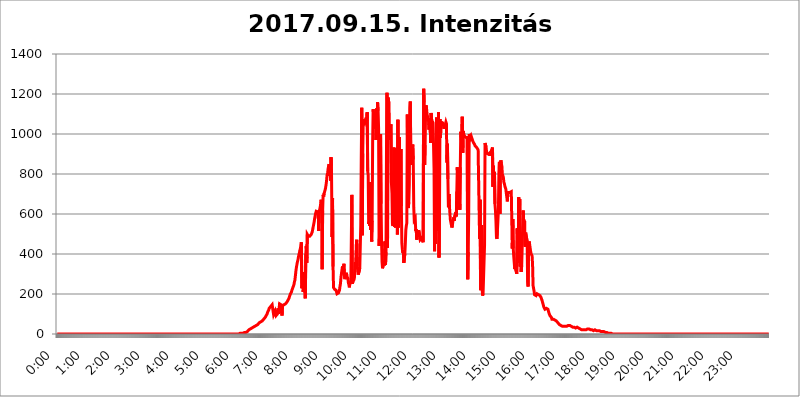
| Category | 2017.09.15. Intenzitás [W/m^2] |
|---|---|
| 0.0 | 0 |
| 0.0006944444444444445 | 0 |
| 0.001388888888888889 | 0 |
| 0.0020833333333333333 | 0 |
| 0.002777777777777778 | 0 |
| 0.003472222222222222 | 0 |
| 0.004166666666666667 | 0 |
| 0.004861111111111111 | 0 |
| 0.005555555555555556 | 0 |
| 0.0062499999999999995 | 0 |
| 0.006944444444444444 | 0 |
| 0.007638888888888889 | 0 |
| 0.008333333333333333 | 0 |
| 0.009027777777777779 | 0 |
| 0.009722222222222222 | 0 |
| 0.010416666666666666 | 0 |
| 0.011111111111111112 | 0 |
| 0.011805555555555555 | 0 |
| 0.012499999999999999 | 0 |
| 0.013194444444444444 | 0 |
| 0.013888888888888888 | 0 |
| 0.014583333333333332 | 0 |
| 0.015277777777777777 | 0 |
| 0.015972222222222224 | 0 |
| 0.016666666666666666 | 0 |
| 0.017361111111111112 | 0 |
| 0.018055555555555557 | 0 |
| 0.01875 | 0 |
| 0.019444444444444445 | 0 |
| 0.02013888888888889 | 0 |
| 0.020833333333333332 | 0 |
| 0.02152777777777778 | 0 |
| 0.022222222222222223 | 0 |
| 0.02291666666666667 | 0 |
| 0.02361111111111111 | 0 |
| 0.024305555555555556 | 0 |
| 0.024999999999999998 | 0 |
| 0.025694444444444447 | 0 |
| 0.02638888888888889 | 0 |
| 0.027083333333333334 | 0 |
| 0.027777777777777776 | 0 |
| 0.02847222222222222 | 0 |
| 0.029166666666666664 | 0 |
| 0.029861111111111113 | 0 |
| 0.030555555555555555 | 0 |
| 0.03125 | 0 |
| 0.03194444444444445 | 0 |
| 0.03263888888888889 | 0 |
| 0.03333333333333333 | 0 |
| 0.034027777777777775 | 0 |
| 0.034722222222222224 | 0 |
| 0.035416666666666666 | 0 |
| 0.036111111111111115 | 0 |
| 0.03680555555555556 | 0 |
| 0.0375 | 0 |
| 0.03819444444444444 | 0 |
| 0.03888888888888889 | 0 |
| 0.03958333333333333 | 0 |
| 0.04027777777777778 | 0 |
| 0.04097222222222222 | 0 |
| 0.041666666666666664 | 0 |
| 0.042361111111111106 | 0 |
| 0.04305555555555556 | 0 |
| 0.043750000000000004 | 0 |
| 0.044444444444444446 | 0 |
| 0.04513888888888889 | 0 |
| 0.04583333333333334 | 0 |
| 0.04652777777777778 | 0 |
| 0.04722222222222222 | 0 |
| 0.04791666666666666 | 0 |
| 0.04861111111111111 | 0 |
| 0.049305555555555554 | 0 |
| 0.049999999999999996 | 0 |
| 0.05069444444444445 | 0 |
| 0.051388888888888894 | 0 |
| 0.052083333333333336 | 0 |
| 0.05277777777777778 | 0 |
| 0.05347222222222222 | 0 |
| 0.05416666666666667 | 0 |
| 0.05486111111111111 | 0 |
| 0.05555555555555555 | 0 |
| 0.05625 | 0 |
| 0.05694444444444444 | 0 |
| 0.057638888888888885 | 0 |
| 0.05833333333333333 | 0 |
| 0.05902777777777778 | 0 |
| 0.059722222222222225 | 0 |
| 0.06041666666666667 | 0 |
| 0.061111111111111116 | 0 |
| 0.06180555555555556 | 0 |
| 0.0625 | 0 |
| 0.06319444444444444 | 0 |
| 0.06388888888888888 | 0 |
| 0.06458333333333334 | 0 |
| 0.06527777777777778 | 0 |
| 0.06597222222222222 | 0 |
| 0.06666666666666667 | 0 |
| 0.06736111111111111 | 0 |
| 0.06805555555555555 | 0 |
| 0.06874999999999999 | 0 |
| 0.06944444444444443 | 0 |
| 0.07013888888888889 | 0 |
| 0.07083333333333333 | 0 |
| 0.07152777777777779 | 0 |
| 0.07222222222222223 | 0 |
| 0.07291666666666667 | 0 |
| 0.07361111111111111 | 0 |
| 0.07430555555555556 | 0 |
| 0.075 | 0 |
| 0.07569444444444444 | 0 |
| 0.0763888888888889 | 0 |
| 0.07708333333333334 | 0 |
| 0.07777777777777778 | 0 |
| 0.07847222222222222 | 0 |
| 0.07916666666666666 | 0 |
| 0.0798611111111111 | 0 |
| 0.08055555555555556 | 0 |
| 0.08125 | 0 |
| 0.08194444444444444 | 0 |
| 0.08263888888888889 | 0 |
| 0.08333333333333333 | 0 |
| 0.08402777777777777 | 0 |
| 0.08472222222222221 | 0 |
| 0.08541666666666665 | 0 |
| 0.08611111111111112 | 0 |
| 0.08680555555555557 | 0 |
| 0.08750000000000001 | 0 |
| 0.08819444444444445 | 0 |
| 0.08888888888888889 | 0 |
| 0.08958333333333333 | 0 |
| 0.09027777777777778 | 0 |
| 0.09097222222222222 | 0 |
| 0.09166666666666667 | 0 |
| 0.09236111111111112 | 0 |
| 0.09305555555555556 | 0 |
| 0.09375 | 0 |
| 0.09444444444444444 | 0 |
| 0.09513888888888888 | 0 |
| 0.09583333333333333 | 0 |
| 0.09652777777777777 | 0 |
| 0.09722222222222222 | 0 |
| 0.09791666666666667 | 0 |
| 0.09861111111111111 | 0 |
| 0.09930555555555555 | 0 |
| 0.09999999999999999 | 0 |
| 0.10069444444444443 | 0 |
| 0.1013888888888889 | 0 |
| 0.10208333333333335 | 0 |
| 0.10277777777777779 | 0 |
| 0.10347222222222223 | 0 |
| 0.10416666666666667 | 0 |
| 0.10486111111111111 | 0 |
| 0.10555555555555556 | 0 |
| 0.10625 | 0 |
| 0.10694444444444444 | 0 |
| 0.1076388888888889 | 0 |
| 0.10833333333333334 | 0 |
| 0.10902777777777778 | 0 |
| 0.10972222222222222 | 0 |
| 0.1111111111111111 | 0 |
| 0.11180555555555556 | 0 |
| 0.11180555555555556 | 0 |
| 0.1125 | 0 |
| 0.11319444444444444 | 0 |
| 0.11388888888888889 | 0 |
| 0.11458333333333333 | 0 |
| 0.11527777777777777 | 0 |
| 0.11597222222222221 | 0 |
| 0.11666666666666665 | 0 |
| 0.1173611111111111 | 0 |
| 0.11805555555555557 | 0 |
| 0.11944444444444445 | 0 |
| 0.12013888888888889 | 0 |
| 0.12083333333333333 | 0 |
| 0.12152777777777778 | 0 |
| 0.12222222222222223 | 0 |
| 0.12291666666666667 | 0 |
| 0.12291666666666667 | 0 |
| 0.12361111111111112 | 0 |
| 0.12430555555555556 | 0 |
| 0.125 | 0 |
| 0.12569444444444444 | 0 |
| 0.12638888888888888 | 0 |
| 0.12708333333333333 | 0 |
| 0.16875 | 0 |
| 0.12847222222222224 | 0 |
| 0.12916666666666668 | 0 |
| 0.12986111111111112 | 0 |
| 0.13055555555555556 | 0 |
| 0.13125 | 0 |
| 0.13194444444444445 | 0 |
| 0.1326388888888889 | 0 |
| 0.13333333333333333 | 0 |
| 0.13402777777777777 | 0 |
| 0.13402777777777777 | 0 |
| 0.13472222222222222 | 0 |
| 0.13541666666666666 | 0 |
| 0.1361111111111111 | 0 |
| 0.13749999999999998 | 0 |
| 0.13819444444444443 | 0 |
| 0.1388888888888889 | 0 |
| 0.13958333333333334 | 0 |
| 0.14027777777777778 | 0 |
| 0.14097222222222222 | 0 |
| 0.14166666666666666 | 0 |
| 0.1423611111111111 | 0 |
| 0.14305555555555557 | 0 |
| 0.14375000000000002 | 0 |
| 0.14444444444444446 | 0 |
| 0.1451388888888889 | 0 |
| 0.1451388888888889 | 0 |
| 0.14652777777777778 | 0 |
| 0.14722222222222223 | 0 |
| 0.14791666666666667 | 0 |
| 0.1486111111111111 | 0 |
| 0.14930555555555555 | 0 |
| 0.15 | 0 |
| 0.15069444444444444 | 0 |
| 0.15138888888888888 | 0 |
| 0.15208333333333332 | 0 |
| 0.15277777777777776 | 0 |
| 0.15347222222222223 | 0 |
| 0.15416666666666667 | 0 |
| 0.15486111111111112 | 0 |
| 0.15555555555555556 | 0 |
| 0.15625 | 0 |
| 0.15694444444444444 | 0 |
| 0.15763888888888888 | 0 |
| 0.15833333333333333 | 0 |
| 0.15902777777777777 | 0 |
| 0.15972222222222224 | 0 |
| 0.16041666666666668 | 0 |
| 0.16111111111111112 | 0 |
| 0.16180555555555556 | 0 |
| 0.1625 | 0 |
| 0.16319444444444445 | 0 |
| 0.1638888888888889 | 0 |
| 0.16458333333333333 | 0 |
| 0.16527777777777777 | 0 |
| 0.16597222222222222 | 0 |
| 0.16666666666666666 | 0 |
| 0.1673611111111111 | 0 |
| 0.16805555555555554 | 0 |
| 0.16874999999999998 | 0 |
| 0.16944444444444443 | 0 |
| 0.17013888888888887 | 0 |
| 0.1708333333333333 | 0 |
| 0.17152777777777775 | 0 |
| 0.17222222222222225 | 0 |
| 0.1729166666666667 | 0 |
| 0.17361111111111113 | 0 |
| 0.17430555555555557 | 0 |
| 0.17500000000000002 | 0 |
| 0.17569444444444446 | 0 |
| 0.1763888888888889 | 0 |
| 0.17708333333333334 | 0 |
| 0.17777777777777778 | 0 |
| 0.17847222222222223 | 0 |
| 0.17916666666666667 | 0 |
| 0.1798611111111111 | 0 |
| 0.18055555555555555 | 0 |
| 0.18125 | 0 |
| 0.18194444444444444 | 0 |
| 0.1826388888888889 | 0 |
| 0.18333333333333335 | 0 |
| 0.1840277777777778 | 0 |
| 0.18472222222222223 | 0 |
| 0.18541666666666667 | 0 |
| 0.18611111111111112 | 0 |
| 0.18680555555555556 | 0 |
| 0.1875 | 0 |
| 0.18819444444444444 | 0 |
| 0.18888888888888888 | 0 |
| 0.18958333333333333 | 0 |
| 0.19027777777777777 | 0 |
| 0.1909722222222222 | 0 |
| 0.19166666666666665 | 0 |
| 0.19236111111111112 | 0 |
| 0.19305555555555554 | 0 |
| 0.19375 | 0 |
| 0.19444444444444445 | 0 |
| 0.1951388888888889 | 0 |
| 0.19583333333333333 | 0 |
| 0.19652777777777777 | 0 |
| 0.19722222222222222 | 0 |
| 0.19791666666666666 | 0 |
| 0.1986111111111111 | 0 |
| 0.19930555555555554 | 0 |
| 0.19999999999999998 | 0 |
| 0.20069444444444443 | 0 |
| 0.20138888888888887 | 0 |
| 0.2020833333333333 | 0 |
| 0.2027777777777778 | 0 |
| 0.2034722222222222 | 0 |
| 0.2041666666666667 | 0 |
| 0.20486111111111113 | 0 |
| 0.20555555555555557 | 0 |
| 0.20625000000000002 | 0 |
| 0.20694444444444446 | 0 |
| 0.2076388888888889 | 0 |
| 0.20833333333333334 | 0 |
| 0.20902777777777778 | 0 |
| 0.20972222222222223 | 0 |
| 0.21041666666666667 | 0 |
| 0.2111111111111111 | 0 |
| 0.21180555555555555 | 0 |
| 0.2125 | 0 |
| 0.21319444444444444 | 0 |
| 0.2138888888888889 | 0 |
| 0.21458333333333335 | 0 |
| 0.2152777777777778 | 0 |
| 0.21597222222222223 | 0 |
| 0.21666666666666667 | 0 |
| 0.21736111111111112 | 0 |
| 0.21805555555555556 | 0 |
| 0.21875 | 0 |
| 0.21944444444444444 | 0 |
| 0.22013888888888888 | 0 |
| 0.22083333333333333 | 0 |
| 0.22152777777777777 | 0 |
| 0.2222222222222222 | 0 |
| 0.22291666666666665 | 0 |
| 0.2236111111111111 | 0 |
| 0.22430555555555556 | 0 |
| 0.225 | 0 |
| 0.22569444444444445 | 0 |
| 0.2263888888888889 | 0 |
| 0.22708333333333333 | 0 |
| 0.22777777777777777 | 0 |
| 0.22847222222222222 | 0 |
| 0.22916666666666666 | 0 |
| 0.2298611111111111 | 0 |
| 0.23055555555555554 | 0 |
| 0.23124999999999998 | 0 |
| 0.23194444444444443 | 0 |
| 0.23263888888888887 | 0 |
| 0.2333333333333333 | 0 |
| 0.2340277777777778 | 0 |
| 0.2347222222222222 | 0 |
| 0.2354166666666667 | 0 |
| 0.23611111111111113 | 0 |
| 0.23680555555555557 | 0 |
| 0.23750000000000002 | 0 |
| 0.23819444444444446 | 0 |
| 0.2388888888888889 | 0 |
| 0.23958333333333334 | 0 |
| 0.24027777777777778 | 0 |
| 0.24097222222222223 | 0 |
| 0.24166666666666667 | 0 |
| 0.2423611111111111 | 0 |
| 0.24305555555555555 | 0 |
| 0.24375 | 0 |
| 0.24444444444444446 | 0 |
| 0.24513888888888888 | 0 |
| 0.24583333333333335 | 0 |
| 0.2465277777777778 | 0 |
| 0.24722222222222223 | 0 |
| 0.24791666666666667 | 0 |
| 0.24861111111111112 | 0 |
| 0.24930555555555556 | 0 |
| 0.25 | 0 |
| 0.25069444444444444 | 0 |
| 0.2513888888888889 | 0 |
| 0.2520833333333333 | 0 |
| 0.25277777777777777 | 0 |
| 0.2534722222222222 | 0 |
| 0.25416666666666665 | 0 |
| 0.2548611111111111 | 0 |
| 0.2555555555555556 | 0 |
| 0.25625000000000003 | 3.525 |
| 0.2569444444444445 | 3.525 |
| 0.2576388888888889 | 3.525 |
| 0.25833333333333336 | 3.525 |
| 0.2590277777777778 | 3.525 |
| 0.25972222222222224 | 3.525 |
| 0.2604166666666667 | 3.525 |
| 0.2611111111111111 | 3.525 |
| 0.26180555555555557 | 7.887 |
| 0.2625 | 7.887 |
| 0.26319444444444445 | 7.887 |
| 0.2638888888888889 | 7.887 |
| 0.26458333333333334 | 7.887 |
| 0.2652777777777778 | 7.887 |
| 0.2659722222222222 | 12.257 |
| 0.26666666666666666 | 12.257 |
| 0.2673611111111111 | 12.257 |
| 0.26805555555555555 | 16.636 |
| 0.26875 | 21.024 |
| 0.26944444444444443 | 21.024 |
| 0.2701388888888889 | 25.419 |
| 0.2708333333333333 | 25.419 |
| 0.27152777777777776 | 29.823 |
| 0.2722222222222222 | 29.823 |
| 0.27291666666666664 | 29.823 |
| 0.2736111111111111 | 29.823 |
| 0.2743055555555555 | 34.234 |
| 0.27499999999999997 | 34.234 |
| 0.27569444444444446 | 38.653 |
| 0.27638888888888885 | 38.653 |
| 0.27708333333333335 | 38.653 |
| 0.2777777777777778 | 43.079 |
| 0.27847222222222223 | 43.079 |
| 0.2791666666666667 | 43.079 |
| 0.2798611111111111 | 47.511 |
| 0.28055555555555556 | 47.511 |
| 0.28125 | 47.511 |
| 0.28194444444444444 | 51.951 |
| 0.2826388888888889 | 51.951 |
| 0.2833333333333333 | 56.398 |
| 0.28402777777777777 | 56.398 |
| 0.2847222222222222 | 56.398 |
| 0.28541666666666665 | 60.85 |
| 0.28611111111111115 | 60.85 |
| 0.28680555555555554 | 65.31 |
| 0.28750000000000003 | 65.31 |
| 0.2881944444444445 | 69.775 |
| 0.2888888888888889 | 69.775 |
| 0.28958333333333336 | 74.246 |
| 0.2902777777777778 | 74.246 |
| 0.29097222222222224 | 78.722 |
| 0.2916666666666667 | 83.205 |
| 0.2923611111111111 | 83.205 |
| 0.29305555555555557 | 92.184 |
| 0.29375 | 96.682 |
| 0.29444444444444445 | 101.184 |
| 0.2951388888888889 | 110.201 |
| 0.29583333333333334 | 114.716 |
| 0.2965277777777778 | 119.235 |
| 0.2972222222222222 | 128.284 |
| 0.29791666666666666 | 128.284 |
| 0.2986111111111111 | 132.814 |
| 0.29930555555555555 | 137.347 |
| 0.3 | 137.347 |
| 0.30069444444444443 | 141.884 |
| 0.3013888888888889 | 146.423 |
| 0.3020833333333333 | 150.964 |
| 0.30277777777777776 | 146.423 |
| 0.3034722222222222 | 96.682 |
| 0.30416666666666664 | 92.184 |
| 0.3048611111111111 | 96.682 |
| 0.3055555555555555 | 114.716 |
| 0.30624999999999997 | 110.201 |
| 0.3069444444444444 | 92.184 |
| 0.3076388888888889 | 92.184 |
| 0.30833333333333335 | 92.184 |
| 0.3090277777777778 | 101.184 |
| 0.30972222222222223 | 128.284 |
| 0.3104166666666667 | 101.184 |
| 0.3111111111111111 | 123.758 |
| 0.31180555555555556 | 150.964 |
| 0.3125 | 146.423 |
| 0.31319444444444444 | 146.423 |
| 0.3138888888888889 | 146.423 |
| 0.3145833333333333 | 146.423 |
| 0.31527777777777777 | 92.184 |
| 0.3159722222222222 | 141.884 |
| 0.31666666666666665 | 141.884 |
| 0.31736111111111115 | 141.884 |
| 0.31805555555555554 | 146.423 |
| 0.31875000000000003 | 146.423 |
| 0.3194444444444445 | 150.964 |
| 0.3201388888888889 | 150.964 |
| 0.32083333333333336 | 150.964 |
| 0.3215277777777778 | 155.509 |
| 0.32222222222222224 | 160.056 |
| 0.3229166666666667 | 164.605 |
| 0.3236111111111111 | 169.156 |
| 0.32430555555555557 | 173.709 |
| 0.325 | 178.264 |
| 0.32569444444444445 | 187.378 |
| 0.3263888888888889 | 191.937 |
| 0.32708333333333334 | 201.058 |
| 0.3277777777777778 | 205.62 |
| 0.3284722222222222 | 210.182 |
| 0.32916666666666666 | 219.309 |
| 0.3298611111111111 | 223.873 |
| 0.33055555555555555 | 233 |
| 0.33125 | 237.564 |
| 0.33194444444444443 | 246.689 |
| 0.3326388888888889 | 260.373 |
| 0.3333333333333333 | 269.49 |
| 0.3340277777777778 | 292.259 |
| 0.3347222222222222 | 314.98 |
| 0.3354166666666667 | 333.113 |
| 0.3361111111111111 | 346.682 |
| 0.3368055555555556 | 360.221 |
| 0.33749999999999997 | 369.23 |
| 0.33819444444444446 | 382.715 |
| 0.33888888888888885 | 396.164 |
| 0.33958333333333335 | 405.108 |
| 0.34027777777777773 | 418.492 |
| 0.34097222222222223 | 427.39 |
| 0.3416666666666666 | 440.702 |
| 0.3423611111111111 | 458.38 |
| 0.3430555555555555 | 228.436 |
| 0.34375 | 242.127 |
| 0.3444444444444445 | 260.373 |
| 0.3451388888888889 | 210.182 |
| 0.3458333333333334 | 310.44 |
| 0.34652777777777777 | 210.182 |
| 0.34722222222222227 | 246.689 |
| 0.34791666666666665 | 178.264 |
| 0.34861111111111115 | 400.638 |
| 0.34930555555555554 | 440.702 |
| 0.35000000000000003 | 355.712 |
| 0.3506944444444444 | 497.836 |
| 0.3513888888888889 | 493.475 |
| 0.3520833333333333 | 489.108 |
| 0.3527777777777778 | 484.735 |
| 0.3534722222222222 | 489.108 |
| 0.3541666666666667 | 489.108 |
| 0.3548611111111111 | 493.475 |
| 0.35555555555555557 | 493.475 |
| 0.35625 | 497.836 |
| 0.35694444444444445 | 502.192 |
| 0.3576388888888889 | 510.885 |
| 0.35833333333333334 | 523.88 |
| 0.3590277777777778 | 536.82 |
| 0.3597222222222222 | 549.704 |
| 0.36041666666666666 | 562.53 |
| 0.3611111111111111 | 579.542 |
| 0.36180555555555555 | 592.233 |
| 0.3625 | 604.864 |
| 0.36319444444444443 | 613.252 |
| 0.3638888888888889 | 617.436 |
| 0.3645833333333333 | 609.062 |
| 0.3652777777777778 | 609.062 |
| 0.3659722222222222 | 617.436 |
| 0.3666666666666667 | 515.223 |
| 0.3673611111111111 | 613.252 |
| 0.3680555555555556 | 621.613 |
| 0.36874999999999997 | 634.105 |
| 0.36944444444444446 | 650.667 |
| 0.37013888888888885 | 671.22 |
| 0.37083333333333335 | 638.256 |
| 0.37152777777777773 | 324.052 |
| 0.37222222222222223 | 617.436 |
| 0.3729166666666666 | 695.666 |
| 0.3736111111111111 | 687.544 |
| 0.3743055555555555 | 703.762 |
| 0.375 | 711.832 |
| 0.3756944444444445 | 719.877 |
| 0.3763888888888889 | 731.896 |
| 0.3770833333333334 | 747.834 |
| 0.37777777777777777 | 767.62 |
| 0.37847222222222227 | 795.074 |
| 0.37916666666666665 | 802.868 |
| 0.37986111111111115 | 826.123 |
| 0.38055555555555554 | 837.682 |
| 0.38125000000000003 | 849.199 |
| 0.3819444444444444 | 791.169 |
| 0.3826388888888889 | 826.123 |
| 0.3833333333333333 | 767.62 |
| 0.3840277777777778 | 883.516 |
| 0.3847222222222222 | 791.169 |
| 0.3854166666666667 | 484.735 |
| 0.3861111111111111 | 679.395 |
| 0.38680555555555557 | 337.639 |
| 0.3875 | 233 |
| 0.38819444444444445 | 228.436 |
| 0.3888888888888889 | 223.873 |
| 0.38958333333333334 | 223.873 |
| 0.3902777777777778 | 219.309 |
| 0.3909722222222222 | 219.309 |
| 0.39166666666666666 | 210.182 |
| 0.3923611111111111 | 201.058 |
| 0.39305555555555555 | 201.058 |
| 0.39375 | 201.058 |
| 0.39444444444444443 | 205.62 |
| 0.3951388888888889 | 210.182 |
| 0.3958333333333333 | 219.309 |
| 0.3965277777777778 | 237.564 |
| 0.3972222222222222 | 251.251 |
| 0.3979166666666667 | 283.156 |
| 0.3986111111111111 | 287.709 |
| 0.3993055555555556 | 319.517 |
| 0.39999999999999997 | 337.639 |
| 0.40069444444444446 | 305.898 |
| 0.40138888888888885 | 328.584 |
| 0.40208333333333335 | 351.198 |
| 0.40277777777777773 | 287.709 |
| 0.40347222222222223 | 274.047 |
| 0.4041666666666666 | 274.047 |
| 0.4048611111111111 | 274.047 |
| 0.4055555555555555 | 305.898 |
| 0.40625 | 287.709 |
| 0.4069444444444445 | 283.156 |
| 0.4076388888888889 | 278.603 |
| 0.4083333333333334 | 255.813 |
| 0.40902777777777777 | 246.689 |
| 0.40972222222222227 | 233 |
| 0.41041666666666665 | 255.813 |
| 0.41111111111111115 | 255.813 |
| 0.41180555555555554 | 264.932 |
| 0.41250000000000003 | 260.373 |
| 0.4131944444444444 | 695.666 |
| 0.4138888888888889 | 251.251 |
| 0.4145833333333333 | 260.373 |
| 0.4152777777777778 | 260.373 |
| 0.4159722222222222 | 269.49 |
| 0.4166666666666667 | 278.603 |
| 0.4173611111111111 | 305.898 |
| 0.41805555555555557 | 337.639 |
| 0.41875 | 373.729 |
| 0.41944444444444445 | 445.129 |
| 0.4201388888888889 | 471.582 |
| 0.42083333333333334 | 337.639 |
| 0.4215277777777778 | 314.98 |
| 0.4222222222222222 | 296.808 |
| 0.42291666666666666 | 292.259 |
| 0.4236111111111111 | 301.354 |
| 0.42430555555555555 | 328.584 |
| 0.425 | 436.27 |
| 0.42569444444444443 | 545.416 |
| 0.4263888888888889 | 875.918 |
| 0.4270833333333333 | 1131.708 |
| 0.4277777777777778 | 493.475 |
| 0.4284722222222222 | 902.447 |
| 0.4291666666666667 | 1074.789 |
| 0.4298611111111111 | 1059.756 |
| 0.4305555555555556 | 1059.756 |
| 0.43124999999999997 | 1052.255 |
| 0.43194444444444446 | 1059.756 |
| 0.43263888888888885 | 1063.51 |
| 0.43333333333333335 | 1082.324 |
| 0.43402777777777773 | 1063.51 |
| 0.43472222222222223 | 1108.816 |
| 0.4354166666666666 | 814.519 |
| 0.4361111111111111 | 795.074 |
| 0.4368055555555555 | 549.704 |
| 0.4375 | 562.53 |
| 0.4381944444444445 | 541.121 |
| 0.4388888888888889 | 759.723 |
| 0.4395833333333334 | 519.555 |
| 0.44027777777777777 | 562.53 |
| 0.44097222222222227 | 462.786 |
| 0.44166666666666665 | 566.793 |
| 0.44236111111111115 | 962.555 |
| 0.44305555555555554 | 1124.056 |
| 0.44375000000000003 | 1097.437 |
| 0.4444444444444444 | 1078.555 |
| 0.4451388888888889 | 1044.762 |
| 0.4458333333333333 | 1026.06 |
| 0.4465277777777778 | 1093.653 |
| 0.4472222222222222 | 970.034 |
| 0.4479166666666667 | 1127.879 |
| 0.4486111111111111 | 1086.097 |
| 0.44930555555555557 | 1158.689 |
| 0.45 | 1116.426 |
| 0.45069444444444445 | 1029.798 |
| 0.4513888888888889 | 440.702 |
| 0.45208333333333334 | 436.27 |
| 0.4527777777777778 | 558.261 |
| 0.4534722222222222 | 999.916 |
| 0.45416666666666666 | 650.667 |
| 0.4548611111111111 | 467.187 |
| 0.45555555555555555 | 360.221 |
| 0.45625 | 328.584 |
| 0.45694444444444443 | 342.162 |
| 0.4576388888888889 | 360.221 |
| 0.4583333333333333 | 351.198 |
| 0.4590277777777778 | 342.162 |
| 0.4597222222222222 | 462.786 |
| 0.4604166666666667 | 346.682 |
| 0.4611111111111111 | 409.574 |
| 0.4618055555555556 | 943.832 |
| 0.46249999999999997 | 1205.82 |
| 0.46319444444444446 | 431.833 |
| 0.46388888888888885 | 1182.099 |
| 0.46458333333333335 | 1166.46 |
| 0.46527777777777773 | 1158.689 |
| 0.46597222222222223 | 970.034 |
| 0.4666666666666666 | 1018.587 |
| 0.4673611111111111 | 1037.277 |
| 0.4680555555555555 | 1048.508 |
| 0.46875 | 751.803 |
| 0.4694444444444445 | 703.762 |
| 0.4701388888888889 | 549.704 |
| 0.4708333333333334 | 541.121 |
| 0.47152777777777777 | 687.544 |
| 0.47222222222222227 | 932.576 |
| 0.47291666666666665 | 536.82 |
| 0.47361111111111115 | 600.661 |
| 0.47430555555555554 | 532.513 |
| 0.47500000000000003 | 558.261 |
| 0.4756944444444444 | 928.819 |
| 0.4763888888888889 | 879.719 |
| 0.4770833333333333 | 497.836 |
| 0.4777777777777778 | 1071.027 |
| 0.4784722222222222 | 532.513 |
| 0.4791666666666667 | 613.252 |
| 0.4798611111111111 | 984.98 |
| 0.48055555555555557 | 650.667 |
| 0.48125 | 625.784 |
| 0.48194444444444445 | 925.06 |
| 0.4826388888888889 | 638.256 |
| 0.48333333333333334 | 453.968 |
| 0.4840277777777778 | 422.943 |
| 0.4847222222222222 | 405.108 |
| 0.48541666666666666 | 414.035 |
| 0.4861111111111111 | 355.712 |
| 0.48680555555555555 | 355.712 |
| 0.4875 | 400.638 |
| 0.48819444444444443 | 453.968 |
| 0.4888888888888889 | 519.555 |
| 0.4895833333333333 | 541.121 |
| 0.4902777777777778 | 553.986 |
| 0.4909722222222222 | 1097.437 |
| 0.4916666666666667 | 783.342 |
| 0.4923611111111111 | 629.948 |
| 0.4930555555555556 | 658.909 |
| 0.49374999999999997 | 747.834 |
| 0.49444444444444446 | 1127.879 |
| 0.49513888888888885 | 1162.571 |
| 0.49583333333333335 | 913.766 |
| 0.49652777777777773 | 845.365 |
| 0.49722222222222223 | 879.719 |
| 0.4979166666666666 | 909.996 |
| 0.4986111111111111 | 947.58 |
| 0.4993055555555555 | 872.114 |
| 0.5 | 634.105 |
| 0.5006944444444444 | 571.049 |
| 0.5013888888888889 | 571.049 |
| 0.5020833333333333 | 579.542 |
| 0.5027777777777778 | 515.223 |
| 0.5034722222222222 | 523.88 |
| 0.5041666666666667 | 471.582 |
| 0.5048611111111111 | 480.356 |
| 0.5055555555555555 | 493.475 |
| 0.50625 | 506.542 |
| 0.5069444444444444 | 519.555 |
| 0.5076388888888889 | 519.555 |
| 0.5083333333333333 | 489.108 |
| 0.5090277777777777 | 471.582 |
| 0.5097222222222222 | 471.582 |
| 0.5104166666666666 | 475.972 |
| 0.5111111111111112 | 480.356 |
| 0.5118055555555555 | 471.582 |
| 0.5125000000000001 | 467.187 |
| 0.5131944444444444 | 458.38 |
| 0.513888888888889 | 1225.859 |
| 0.5145833333333333 | 1158.689 |
| 0.5152777777777778 | 845.365 |
| 0.5159722222222222 | 943.832 |
| 0.5166666666666667 | 1131.708 |
| 0.517361111111111 | 1143.232 |
| 0.5180555555555556 | 1124.056 |
| 0.5187499999999999 | 1097.437 |
| 0.5194444444444445 | 1086.097 |
| 0.5201388888888888 | 1063.51 |
| 0.5208333333333334 | 1074.789 |
| 0.5215277777777778 | 1022.323 |
| 0.5222222222222223 | 1071.027 |
| 0.5229166666666667 | 1078.555 |
| 0.5236111111111111 | 955.071 |
| 0.5243055555555556 | 1105.019 |
| 0.525 | 1074.789 |
| 0.5256944444444445 | 1067.267 |
| 0.5263888888888889 | 1063.51 |
| 0.5270833333333333 | 1056.004 |
| 0.5277777777777778 | 1052.255 |
| 0.5284722222222222 | 826.123 |
| 0.5291666666666667 | 414.035 |
| 0.5298611111111111 | 856.855 |
| 0.5305555555555556 | 449.551 |
| 0.53125 | 837.682 |
| 0.5319444444444444 | 1082.324 |
| 0.5326388888888889 | 600.661 |
| 0.5333333333333333 | 699.717 |
| 0.5340277777777778 | 515.223 |
| 0.5347222222222222 | 1108.816 |
| 0.5354166666666667 | 382.715 |
| 0.5361111111111111 | 617.436 |
| 0.5368055555555555 | 1074.789 |
| 0.5375 | 981.244 |
| 0.5381944444444444 | 1063.51 |
| 0.5388888888888889 | 1048.508 |
| 0.5395833333333333 | 1044.762 |
| 0.5402777777777777 | 1052.255 |
| 0.5409722222222222 | 1052.255 |
| 0.5416666666666666 | 1044.762 |
| 0.5423611111111112 | 1026.06 |
| 0.5430555555555555 | 1041.019 |
| 0.5437500000000001 | 1037.277 |
| 0.5444444444444444 | 1048.508 |
| 0.545138888888889 | 1059.756 |
| 0.5458333333333333 | 1052.255 |
| 0.5465277777777778 | 856.855 |
| 0.5472222222222222 | 951.327 |
| 0.5479166666666667 | 775.492 |
| 0.548611111111111 | 634.105 |
| 0.5493055555555556 | 699.717 |
| 0.5499999999999999 | 642.4 |
| 0.5506944444444445 | 604.864 |
| 0.5513888888888888 | 571.049 |
| 0.5520833333333334 | 558.261 |
| 0.5527777777777778 | 562.53 |
| 0.5534722222222223 | 532.513 |
| 0.5541666666666667 | 541.121 |
| 0.5548611111111111 | 562.53 |
| 0.5555555555555556 | 575.299 |
| 0.55625 | 583.779 |
| 0.5569444444444445 | 566.793 |
| 0.5576388888888889 | 592.233 |
| 0.5583333333333333 | 596.45 |
| 0.5590277777777778 | 609.062 |
| 0.5597222222222222 | 588.009 |
| 0.5604166666666667 | 711.832 |
| 0.5611111111111111 | 833.834 |
| 0.5618055555555556 | 715.858 |
| 0.5625 | 683.473 |
| 0.5631944444444444 | 667.123 |
| 0.5638888888888889 | 707.8 |
| 0.5645833333333333 | 621.613 |
| 0.5652777777777778 | 833.834 |
| 0.5659722222222222 | 1011.118 |
| 0.5666666666666667 | 970.034 |
| 0.5673611111111111 | 962.555 |
| 0.5680555555555555 | 1086.097 |
| 0.56875 | 906.223 |
| 0.5694444444444444 | 1014.852 |
| 0.5701388888888889 | 999.916 |
| 0.5708333333333333 | 992.448 |
| 0.5715277777777777 | 988.714 |
| 0.5722222222222222 | 984.98 |
| 0.5729166666666666 | 984.98 |
| 0.5736111111111112 | 981.244 |
| 0.5743055555555555 | 981.244 |
| 0.5750000000000001 | 988.714 |
| 0.5756944444444444 | 274.047 |
| 0.576388888888889 | 409.574 |
| 0.5770833333333333 | 600.661 |
| 0.5777777777777778 | 999.916 |
| 0.5784722222222222 | 996.182 |
| 0.5791666666666667 | 988.714 |
| 0.579861111111111 | 981.244 |
| 0.5805555555555556 | 988.714 |
| 0.5812499999999999 | 981.244 |
| 0.5819444444444445 | 973.772 |
| 0.5826388888888888 | 966.295 |
| 0.5833333333333334 | 962.555 |
| 0.5840277777777778 | 955.071 |
| 0.5847222222222223 | 951.327 |
| 0.5854166666666667 | 947.58 |
| 0.5861111111111111 | 940.082 |
| 0.5868055555555556 | 936.33 |
| 0.5875 | 936.33 |
| 0.5881944444444445 | 932.576 |
| 0.5888888888888889 | 936.33 |
| 0.5895833333333333 | 928.819 |
| 0.5902777777777778 | 921.298 |
| 0.5909722222222222 | 921.298 |
| 0.5916666666666667 | 925.06 |
| 0.5923611111111111 | 475.972 |
| 0.5930555555555556 | 671.22 |
| 0.59375 | 219.309 |
| 0.5944444444444444 | 228.436 |
| 0.5951388888888889 | 545.416 |
| 0.5958333333333333 | 233 |
| 0.5965277777777778 | 191.937 |
| 0.5972222222222222 | 201.058 |
| 0.5979166666666667 | 205.62 |
| 0.5986111111111111 | 205.62 |
| 0.5993055555555555 | 445.129 |
| 0.6 | 955.071 |
| 0.6006944444444444 | 955.071 |
| 0.6013888888888889 | 936.33 |
| 0.6020833333333333 | 913.766 |
| 0.6027777777777777 | 902.447 |
| 0.6034722222222222 | 898.668 |
| 0.6041666666666666 | 898.668 |
| 0.6048611111111112 | 898.668 |
| 0.6055555555555555 | 898.668 |
| 0.6062500000000001 | 902.447 |
| 0.6069444444444444 | 906.223 |
| 0.607638888888889 | 891.099 |
| 0.6083333333333333 | 909.996 |
| 0.6090277777777778 | 913.766 |
| 0.6097222222222222 | 925.06 |
| 0.6104166666666667 | 932.576 |
| 0.611111111111111 | 735.89 |
| 0.6118055555555556 | 841.526 |
| 0.6124999999999999 | 751.803 |
| 0.6131944444444445 | 810.641 |
| 0.6138888888888888 | 650.667 |
| 0.6145833333333334 | 617.436 |
| 0.6152777777777778 | 566.793 |
| 0.6159722222222223 | 484.735 |
| 0.6166666666666667 | 475.972 |
| 0.6173611111111111 | 519.555 |
| 0.6180555555555556 | 566.793 |
| 0.61875 | 621.613 |
| 0.6194444444444445 | 806.757 |
| 0.6201388888888889 | 860.676 |
| 0.6208333333333333 | 600.661 |
| 0.6215277777777778 | 860.676 |
| 0.6222222222222222 | 868.305 |
| 0.6229166666666667 | 853.029 |
| 0.6236111111111111 | 837.682 |
| 0.6243055555555556 | 798.974 |
| 0.625 | 802.868 |
| 0.6256944444444444 | 783.342 |
| 0.6263888888888889 | 759.723 |
| 0.6270833333333333 | 751.803 |
| 0.6277777777777778 | 739.877 |
| 0.6284722222222222 | 731.896 |
| 0.6291666666666667 | 723.889 |
| 0.6298611111111111 | 719.877 |
| 0.6305555555555555 | 719.877 |
| 0.63125 | 663.019 |
| 0.6319444444444444 | 699.717 |
| 0.6326388888888889 | 707.8 |
| 0.6333333333333333 | 707.8 |
| 0.6340277777777777 | 707.8 |
| 0.6347222222222222 | 707.8 |
| 0.6354166666666666 | 703.762 |
| 0.6361111111111112 | 703.762 |
| 0.6368055555555555 | 711.832 |
| 0.6375000000000001 | 715.858 |
| 0.6381944444444444 | 427.39 |
| 0.638888888888889 | 575.299 |
| 0.6395833333333333 | 427.39 |
| 0.6402777777777778 | 387.202 |
| 0.6409722222222222 | 355.712 |
| 0.6416666666666667 | 324.052 |
| 0.642361111111111 | 337.639 |
| 0.6430555555555556 | 333.113 |
| 0.6437499999999999 | 342.162 |
| 0.6444444444444445 | 301.354 |
| 0.6451388888888888 | 528.2 |
| 0.6458333333333334 | 427.39 |
| 0.6465277777777778 | 355.712 |
| 0.6472222222222223 | 683.473 |
| 0.6479166666666667 | 373.729 |
| 0.6486111111111111 | 675.311 |
| 0.6493055555555556 | 337.639 |
| 0.65 | 506.542 |
| 0.6506944444444445 | 310.44 |
| 0.6513888888888889 | 342.162 |
| 0.6520833333333333 | 431.833 |
| 0.6527777777777778 | 532.513 |
| 0.6534722222222222 | 617.436 |
| 0.6541666666666667 | 571.049 |
| 0.6548611111111111 | 571.049 |
| 0.6555555555555556 | 562.53 |
| 0.65625 | 436.27 |
| 0.6569444444444444 | 506.542 |
| 0.6576388888888889 | 510.885 |
| 0.6583333333333333 | 510.885 |
| 0.6590277777777778 | 462.786 |
| 0.6597222222222222 | 260.373 |
| 0.6604166666666667 | 237.564 |
| 0.6611111111111111 | 445.129 |
| 0.6618055555555555 | 462.786 |
| 0.6625 | 449.551 |
| 0.6631944444444444 | 431.833 |
| 0.6638888888888889 | 414.035 |
| 0.6645833333333333 | 400.638 |
| 0.6652777777777777 | 400.638 |
| 0.6659722222222222 | 391.685 |
| 0.6666666666666666 | 346.682 |
| 0.6673611111111111 | 242.127 |
| 0.6680555555555556 | 246.689 |
| 0.6687500000000001 | 214.746 |
| 0.6694444444444444 | 196.497 |
| 0.6701388888888888 | 196.497 |
| 0.6708333333333334 | 191.937 |
| 0.6715277777777778 | 191.937 |
| 0.6722222222222222 | 191.937 |
| 0.6729166666666666 | 201.058 |
| 0.6736111111111112 | 201.058 |
| 0.6743055555555556 | 201.058 |
| 0.6749999999999999 | 196.497 |
| 0.6756944444444444 | 191.937 |
| 0.6763888888888889 | 191.937 |
| 0.6770833333333334 | 191.937 |
| 0.6777777777777777 | 191.937 |
| 0.6784722222222223 | 182.82 |
| 0.6791666666666667 | 178.264 |
| 0.6798611111111111 | 169.156 |
| 0.6805555555555555 | 160.056 |
| 0.68125 | 150.964 |
| 0.6819444444444445 | 141.884 |
| 0.6826388888888889 | 132.814 |
| 0.6833333333333332 | 128.284 |
| 0.6840277777777778 | 123.758 |
| 0.6847222222222222 | 128.284 |
| 0.6854166666666667 | 128.284 |
| 0.686111111111111 | 128.284 |
| 0.6868055555555556 | 132.814 |
| 0.6875 | 128.284 |
| 0.6881944444444444 | 123.758 |
| 0.688888888888889 | 114.716 |
| 0.6895833333333333 | 105.69 |
| 0.6902777777777778 | 101.184 |
| 0.6909722222222222 | 92.184 |
| 0.6916666666666668 | 92.184 |
| 0.6923611111111111 | 87.692 |
| 0.6930555555555555 | 83.205 |
| 0.69375 | 74.246 |
| 0.6944444444444445 | 69.775 |
| 0.6951388888888889 | 74.246 |
| 0.6958333333333333 | 74.246 |
| 0.6965277777777777 | 74.246 |
| 0.6972222222222223 | 74.246 |
| 0.6979166666666666 | 69.775 |
| 0.6986111111111111 | 69.775 |
| 0.6993055555555556 | 69.775 |
| 0.7000000000000001 | 65.31 |
| 0.7006944444444444 | 65.31 |
| 0.7013888888888888 | 60.85 |
| 0.7020833333333334 | 56.398 |
| 0.7027777777777778 | 56.398 |
| 0.7034722222222222 | 51.951 |
| 0.7041666666666666 | 47.511 |
| 0.7048611111111112 | 47.511 |
| 0.7055555555555556 | 43.079 |
| 0.7062499999999999 | 43.079 |
| 0.7069444444444444 | 38.653 |
| 0.7076388888888889 | 38.653 |
| 0.7083333333333334 | 38.653 |
| 0.7090277777777777 | 38.653 |
| 0.7097222222222223 | 38.653 |
| 0.7104166666666667 | 38.653 |
| 0.7111111111111111 | 38.653 |
| 0.7118055555555555 | 38.653 |
| 0.7125 | 38.653 |
| 0.7131944444444445 | 38.653 |
| 0.7138888888888889 | 38.653 |
| 0.7145833333333332 | 38.653 |
| 0.7152777777777778 | 43.079 |
| 0.7159722222222222 | 43.079 |
| 0.7166666666666667 | 43.079 |
| 0.717361111111111 | 43.079 |
| 0.7180555555555556 | 43.079 |
| 0.71875 | 43.079 |
| 0.7194444444444444 | 38.653 |
| 0.720138888888889 | 38.653 |
| 0.7208333333333333 | 38.653 |
| 0.7215277777777778 | 38.653 |
| 0.7222222222222222 | 34.234 |
| 0.7229166666666668 | 34.234 |
| 0.7236111111111111 | 34.234 |
| 0.7243055555555555 | 34.234 |
| 0.725 | 34.234 |
| 0.7256944444444445 | 29.823 |
| 0.7263888888888889 | 29.823 |
| 0.7270833333333333 | 29.823 |
| 0.7277777777777777 | 34.234 |
| 0.7284722222222223 | 34.234 |
| 0.7291666666666666 | 34.234 |
| 0.7298611111111111 | 29.823 |
| 0.7305555555555556 | 29.823 |
| 0.7312500000000001 | 29.823 |
| 0.7319444444444444 | 29.823 |
| 0.7326388888888888 | 25.419 |
| 0.7333333333333334 | 25.419 |
| 0.7340277777777778 | 21.024 |
| 0.7347222222222222 | 21.024 |
| 0.7354166666666666 | 21.024 |
| 0.7361111111111112 | 21.024 |
| 0.7368055555555556 | 21.024 |
| 0.7374999999999999 | 21.024 |
| 0.7381944444444444 | 21.024 |
| 0.7388888888888889 | 21.024 |
| 0.7395833333333334 | 21.024 |
| 0.7402777777777777 | 21.024 |
| 0.7409722222222223 | 21.024 |
| 0.7416666666666667 | 21.024 |
| 0.7423611111111111 | 25.419 |
| 0.7430555555555555 | 25.419 |
| 0.74375 | 25.419 |
| 0.7444444444444445 | 25.419 |
| 0.7451388888888889 | 25.419 |
| 0.7458333333333332 | 25.419 |
| 0.7465277777777778 | 25.419 |
| 0.7472222222222222 | 25.419 |
| 0.7479166666666667 | 21.024 |
| 0.748611111111111 | 21.024 |
| 0.7493055555555556 | 21.024 |
| 0.75 | 21.024 |
| 0.7506944444444444 | 21.024 |
| 0.751388888888889 | 16.636 |
| 0.7520833333333333 | 16.636 |
| 0.7527777777777778 | 21.024 |
| 0.7534722222222222 | 21.024 |
| 0.7541666666666668 | 21.024 |
| 0.7548611111111111 | 21.024 |
| 0.7555555555555555 | 21.024 |
| 0.75625 | 16.636 |
| 0.7569444444444445 | 21.024 |
| 0.7576388888888889 | 16.636 |
| 0.7583333333333333 | 16.636 |
| 0.7590277777777777 | 16.636 |
| 0.7597222222222223 | 16.636 |
| 0.7604166666666666 | 16.636 |
| 0.7611111111111111 | 16.636 |
| 0.7618055555555556 | 16.636 |
| 0.7625000000000001 | 12.257 |
| 0.7631944444444444 | 12.257 |
| 0.7638888888888888 | 12.257 |
| 0.7645833333333334 | 12.257 |
| 0.7652777777777778 | 12.257 |
| 0.7659722222222222 | 12.257 |
| 0.7666666666666666 | 12.257 |
| 0.7673611111111112 | 12.257 |
| 0.7680555555555556 | 12.257 |
| 0.7687499999999999 | 7.887 |
| 0.7694444444444444 | 12.257 |
| 0.7701388888888889 | 7.887 |
| 0.7708333333333334 | 7.887 |
| 0.7715277777777777 | 7.887 |
| 0.7722222222222223 | 7.887 |
| 0.7729166666666667 | 3.525 |
| 0.7736111111111111 | 3.525 |
| 0.7743055555555555 | 3.525 |
| 0.775 | 3.525 |
| 0.7756944444444445 | 3.525 |
| 0.7763888888888889 | 3.525 |
| 0.7770833333333332 | 3.525 |
| 0.7777777777777778 | 3.525 |
| 0.7784722222222222 | 3.525 |
| 0.7791666666666667 | 0 |
| 0.779861111111111 | 0 |
| 0.7805555555555556 | 0 |
| 0.78125 | 0 |
| 0.7819444444444444 | 0 |
| 0.782638888888889 | 0 |
| 0.7833333333333333 | 0 |
| 0.7840277777777778 | 0 |
| 0.7847222222222222 | 0 |
| 0.7854166666666668 | 0 |
| 0.7861111111111111 | 0 |
| 0.7868055555555555 | 0 |
| 0.7875 | 0 |
| 0.7881944444444445 | 0 |
| 0.7888888888888889 | 0 |
| 0.7895833333333333 | 0 |
| 0.7902777777777777 | 0 |
| 0.7909722222222223 | 0 |
| 0.7916666666666666 | 0 |
| 0.7923611111111111 | 0 |
| 0.7930555555555556 | 0 |
| 0.7937500000000001 | 0 |
| 0.7944444444444444 | 0 |
| 0.7951388888888888 | 0 |
| 0.7958333333333334 | 0 |
| 0.7965277777777778 | 0 |
| 0.7972222222222222 | 0 |
| 0.7979166666666666 | 0 |
| 0.7986111111111112 | 0 |
| 0.7993055555555556 | 0 |
| 0.7999999999999999 | 0 |
| 0.8006944444444444 | 0 |
| 0.8013888888888889 | 0 |
| 0.8020833333333334 | 0 |
| 0.8027777777777777 | 0 |
| 0.8034722222222223 | 0 |
| 0.8041666666666667 | 0 |
| 0.8048611111111111 | 0 |
| 0.8055555555555555 | 0 |
| 0.80625 | 0 |
| 0.8069444444444445 | 0 |
| 0.8076388888888889 | 0 |
| 0.8083333333333332 | 0 |
| 0.8090277777777778 | 0 |
| 0.8097222222222222 | 0 |
| 0.8104166666666667 | 0 |
| 0.811111111111111 | 0 |
| 0.8118055555555556 | 0 |
| 0.8125 | 0 |
| 0.8131944444444444 | 0 |
| 0.813888888888889 | 0 |
| 0.8145833333333333 | 0 |
| 0.8152777777777778 | 0 |
| 0.8159722222222222 | 0 |
| 0.8166666666666668 | 0 |
| 0.8173611111111111 | 0 |
| 0.8180555555555555 | 0 |
| 0.81875 | 0 |
| 0.8194444444444445 | 0 |
| 0.8201388888888889 | 0 |
| 0.8208333333333333 | 0 |
| 0.8215277777777777 | 0 |
| 0.8222222222222223 | 0 |
| 0.8229166666666666 | 0 |
| 0.8236111111111111 | 0 |
| 0.8243055555555556 | 0 |
| 0.8250000000000001 | 0 |
| 0.8256944444444444 | 0 |
| 0.8263888888888888 | 0 |
| 0.8270833333333334 | 0 |
| 0.8277777777777778 | 0 |
| 0.8284722222222222 | 0 |
| 0.8291666666666666 | 0 |
| 0.8298611111111112 | 0 |
| 0.8305555555555556 | 0 |
| 0.8312499999999999 | 0 |
| 0.8319444444444444 | 0 |
| 0.8326388888888889 | 0 |
| 0.8333333333333334 | 0 |
| 0.8340277777777777 | 0 |
| 0.8347222222222223 | 0 |
| 0.8354166666666667 | 0 |
| 0.8361111111111111 | 0 |
| 0.8368055555555555 | 0 |
| 0.8375 | 0 |
| 0.8381944444444445 | 0 |
| 0.8388888888888889 | 0 |
| 0.8395833333333332 | 0 |
| 0.8402777777777778 | 0 |
| 0.8409722222222222 | 0 |
| 0.8416666666666667 | 0 |
| 0.842361111111111 | 0 |
| 0.8430555555555556 | 0 |
| 0.84375 | 0 |
| 0.8444444444444444 | 0 |
| 0.845138888888889 | 0 |
| 0.8458333333333333 | 0 |
| 0.8465277777777778 | 0 |
| 0.8472222222222222 | 0 |
| 0.8479166666666668 | 0 |
| 0.8486111111111111 | 0 |
| 0.8493055555555555 | 0 |
| 0.85 | 0 |
| 0.8506944444444445 | 0 |
| 0.8513888888888889 | 0 |
| 0.8520833333333333 | 0 |
| 0.8527777777777777 | 0 |
| 0.8534722222222223 | 0 |
| 0.8541666666666666 | 0 |
| 0.8548611111111111 | 0 |
| 0.8555555555555556 | 0 |
| 0.8562500000000001 | 0 |
| 0.8569444444444444 | 0 |
| 0.8576388888888888 | 0 |
| 0.8583333333333334 | 0 |
| 0.8590277777777778 | 0 |
| 0.8597222222222222 | 0 |
| 0.8604166666666666 | 0 |
| 0.8611111111111112 | 0 |
| 0.8618055555555556 | 0 |
| 0.8624999999999999 | 0 |
| 0.8631944444444444 | 0 |
| 0.8638888888888889 | 0 |
| 0.8645833333333334 | 0 |
| 0.8652777777777777 | 0 |
| 0.8659722222222223 | 0 |
| 0.8666666666666667 | 0 |
| 0.8673611111111111 | 0 |
| 0.8680555555555555 | 0 |
| 0.86875 | 0 |
| 0.8694444444444445 | 0 |
| 0.8701388888888889 | 0 |
| 0.8708333333333332 | 0 |
| 0.8715277777777778 | 0 |
| 0.8722222222222222 | 0 |
| 0.8729166666666667 | 0 |
| 0.873611111111111 | 0 |
| 0.8743055555555556 | 0 |
| 0.875 | 0 |
| 0.8756944444444444 | 0 |
| 0.876388888888889 | 0 |
| 0.8770833333333333 | 0 |
| 0.8777777777777778 | 0 |
| 0.8784722222222222 | 0 |
| 0.8791666666666668 | 0 |
| 0.8798611111111111 | 0 |
| 0.8805555555555555 | 0 |
| 0.88125 | 0 |
| 0.8819444444444445 | 0 |
| 0.8826388888888889 | 0 |
| 0.8833333333333333 | 0 |
| 0.8840277777777777 | 0 |
| 0.8847222222222223 | 0 |
| 0.8854166666666666 | 0 |
| 0.8861111111111111 | 0 |
| 0.8868055555555556 | 0 |
| 0.8875000000000001 | 0 |
| 0.8881944444444444 | 0 |
| 0.8888888888888888 | 0 |
| 0.8895833333333334 | 0 |
| 0.8902777777777778 | 0 |
| 0.8909722222222222 | 0 |
| 0.8916666666666666 | 0 |
| 0.8923611111111112 | 0 |
| 0.8930555555555556 | 0 |
| 0.8937499999999999 | 0 |
| 0.8944444444444444 | 0 |
| 0.8951388888888889 | 0 |
| 0.8958333333333334 | 0 |
| 0.8965277777777777 | 0 |
| 0.8972222222222223 | 0 |
| 0.8979166666666667 | 0 |
| 0.8986111111111111 | 0 |
| 0.8993055555555555 | 0 |
| 0.9 | 0 |
| 0.9006944444444445 | 0 |
| 0.9013888888888889 | 0 |
| 0.9020833333333332 | 0 |
| 0.9027777777777778 | 0 |
| 0.9034722222222222 | 0 |
| 0.9041666666666667 | 0 |
| 0.904861111111111 | 0 |
| 0.9055555555555556 | 0 |
| 0.90625 | 0 |
| 0.9069444444444444 | 0 |
| 0.907638888888889 | 0 |
| 0.9083333333333333 | 0 |
| 0.9090277777777778 | 0 |
| 0.9097222222222222 | 0 |
| 0.9104166666666668 | 0 |
| 0.9111111111111111 | 0 |
| 0.9118055555555555 | 0 |
| 0.9125 | 0 |
| 0.9131944444444445 | 0 |
| 0.9138888888888889 | 0 |
| 0.9145833333333333 | 0 |
| 0.9152777777777777 | 0 |
| 0.9159722222222223 | 0 |
| 0.9166666666666666 | 0 |
| 0.9173611111111111 | 0 |
| 0.9180555555555556 | 0 |
| 0.9187500000000001 | 0 |
| 0.9194444444444444 | 0 |
| 0.9201388888888888 | 0 |
| 0.9208333333333334 | 0 |
| 0.9215277777777778 | 0 |
| 0.9222222222222222 | 0 |
| 0.9229166666666666 | 0 |
| 0.9236111111111112 | 0 |
| 0.9243055555555556 | 0 |
| 0.9249999999999999 | 0 |
| 0.9256944444444444 | 0 |
| 0.9263888888888889 | 0 |
| 0.9270833333333334 | 0 |
| 0.9277777777777777 | 0 |
| 0.9284722222222223 | 0 |
| 0.9291666666666667 | 0 |
| 0.9298611111111111 | 0 |
| 0.9305555555555555 | 0 |
| 0.93125 | 0 |
| 0.9319444444444445 | 0 |
| 0.9326388888888889 | 0 |
| 0.9333333333333332 | 0 |
| 0.9340277777777778 | 0 |
| 0.9347222222222222 | 0 |
| 0.9354166666666667 | 0 |
| 0.936111111111111 | 0 |
| 0.9368055555555556 | 0 |
| 0.9375 | 0 |
| 0.9381944444444444 | 0 |
| 0.938888888888889 | 0 |
| 0.9395833333333333 | 0 |
| 0.9402777777777778 | 0 |
| 0.9409722222222222 | 0 |
| 0.9416666666666668 | 0 |
| 0.9423611111111111 | 0 |
| 0.9430555555555555 | 0 |
| 0.94375 | 0 |
| 0.9444444444444445 | 0 |
| 0.9451388888888889 | 0 |
| 0.9458333333333333 | 0 |
| 0.9465277777777777 | 0 |
| 0.9472222222222223 | 0 |
| 0.9479166666666666 | 0 |
| 0.9486111111111111 | 0 |
| 0.9493055555555556 | 0 |
| 0.9500000000000001 | 0 |
| 0.9506944444444444 | 0 |
| 0.9513888888888888 | 0 |
| 0.9520833333333334 | 0 |
| 0.9527777777777778 | 0 |
| 0.9534722222222222 | 0 |
| 0.9541666666666666 | 0 |
| 0.9548611111111112 | 0 |
| 0.9555555555555556 | 0 |
| 0.9562499999999999 | 0 |
| 0.9569444444444444 | 0 |
| 0.9576388888888889 | 0 |
| 0.9583333333333334 | 0 |
| 0.9590277777777777 | 0 |
| 0.9597222222222223 | 0 |
| 0.9604166666666667 | 0 |
| 0.9611111111111111 | 0 |
| 0.9618055555555555 | 0 |
| 0.9625 | 0 |
| 0.9631944444444445 | 0 |
| 0.9638888888888889 | 0 |
| 0.9645833333333332 | 0 |
| 0.9652777777777778 | 0 |
| 0.9659722222222222 | 0 |
| 0.9666666666666667 | 0 |
| 0.967361111111111 | 0 |
| 0.9680555555555556 | 0 |
| 0.96875 | 0 |
| 0.9694444444444444 | 0 |
| 0.970138888888889 | 0 |
| 0.9708333333333333 | 0 |
| 0.9715277777777778 | 0 |
| 0.9722222222222222 | 0 |
| 0.9729166666666668 | 0 |
| 0.9736111111111111 | 0 |
| 0.9743055555555555 | 0 |
| 0.975 | 0 |
| 0.9756944444444445 | 0 |
| 0.9763888888888889 | 0 |
| 0.9770833333333333 | 0 |
| 0.9777777777777777 | 0 |
| 0.9784722222222223 | 0 |
| 0.9791666666666666 | 0 |
| 0.9798611111111111 | 0 |
| 0.9805555555555556 | 0 |
| 0.9812500000000001 | 0 |
| 0.9819444444444444 | 0 |
| 0.9826388888888888 | 0 |
| 0.9833333333333334 | 0 |
| 0.9840277777777778 | 0 |
| 0.9847222222222222 | 0 |
| 0.9854166666666666 | 0 |
| 0.9861111111111112 | 0 |
| 0.9868055555555556 | 0 |
| 0.9874999999999999 | 0 |
| 0.9881944444444444 | 0 |
| 0.9888888888888889 | 0 |
| 0.9895833333333334 | 0 |
| 0.9902777777777777 | 0 |
| 0.9909722222222223 | 0 |
| 0.9916666666666667 | 0 |
| 0.9923611111111111 | 0 |
| 0.9930555555555555 | 0 |
| 0.99375 | 0 |
| 0.9944444444444445 | 0 |
| 0.9951388888888889 | 0 |
| 0.9958333333333332 | 0 |
| 0.9965277777777778 | 0 |
| 0.9972222222222222 | 0 |
| 0.9979166666666667 | 0 |
| 0.998611111111111 | 0 |
| 0.9993055555555556 | 0 |